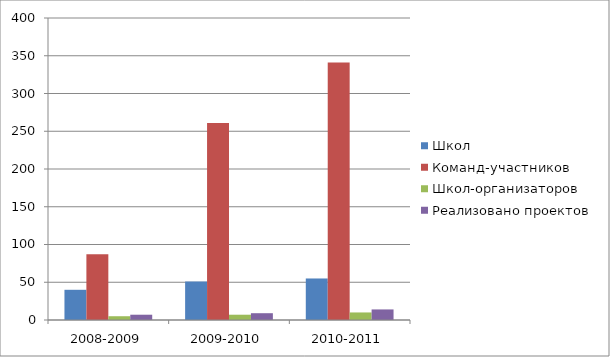
| Category | Школ | Команд-участников | Школ-организаторов | Реализовано проектов |
|---|---|---|---|---|
| 2008-2009 | 40 | 87 | 5 | 7 |
| 2009-2010 | 51 | 261 | 7 | 9 |
| 2010-2011 | 55 | 341 | 10 | 14 |